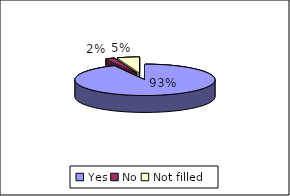
| Category | During the procedure did the doctor explain to you what she was doing |
|---|---|
| Yes | 90 |
| No | 2 |
| Not filled | 5 |